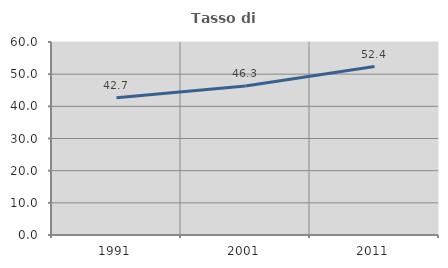
| Category | Tasso di occupazione   |
|---|---|
| 1991.0 | 42.675 |
| 2001.0 | 46.324 |
| 2011.0 | 52.364 |